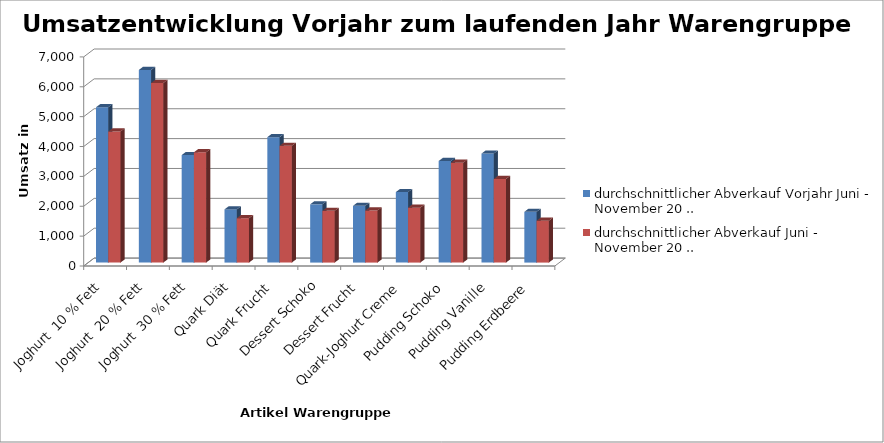
| Category | durchschnittlicher Abverkauf Vorjahr Juni - November 20 .. | durchschnittlicher Abverkauf Juni - November 20 .. |
|---|---|---|
| Joghurt  10 % Fett | 5200 | 4388.333 |
| Joghurt  20 % Fett | 6450 | 6011.667 |
| Joghurt  30 % Fett | 3600 | 3693.333 |
| Quark Diät | 1780 | 1485.833 |
| Quark Frucht | 4200 | 3909.167 |
| Dessert Schoko | 1950 | 1731.667 |
| Dessert Frucht | 1900 | 1743.333 |
| Quark-Joghurt Creme  | 2360 | 1838.333 |
| Pudding Schoko | 3400 | 3341.667 |
| Pudding Vanille | 3650 | 2798.333 |
| Pudding Erdbeere | 1700 | 1401.667 |